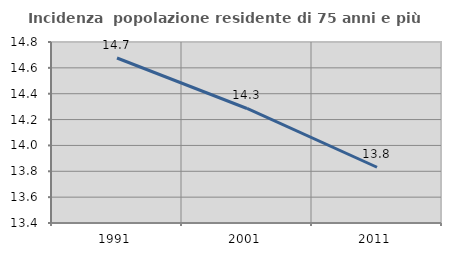
| Category | Incidenza  popolazione residente di 75 anni e più |
|---|---|
| 1991.0 | 14.676 |
| 2001.0 | 14.286 |
| 2011.0 | 13.831 |